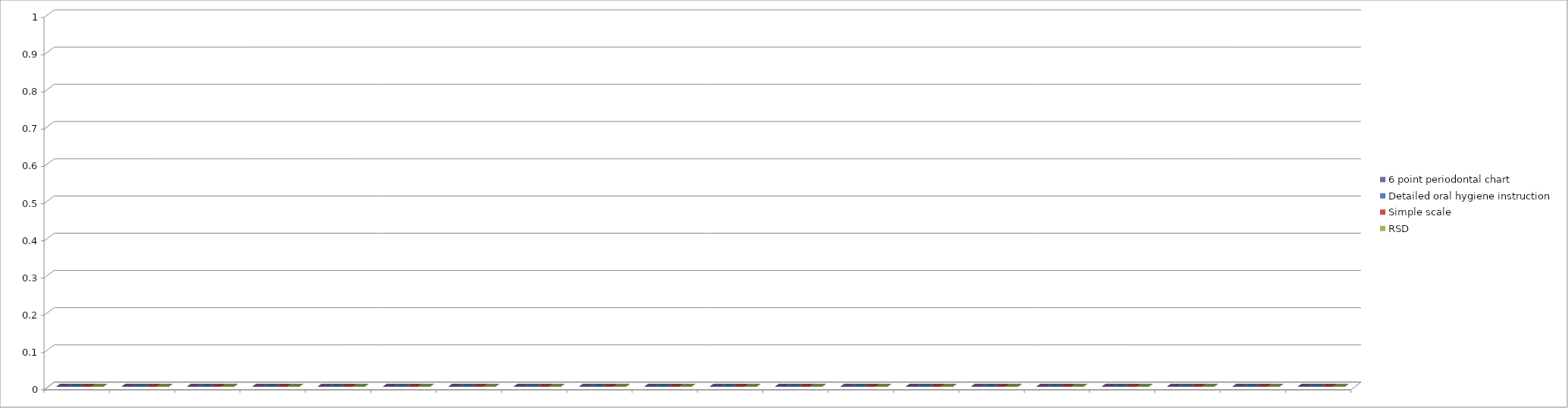
| Category | 6 point periodontal chart | Detailed oral hygiene instruction | Simple scale | RSD |
|---|---|---|---|---|
| 0 | 0 | 0 | 0 | 0 |
| 1 | 0 | 0 | 0 | 0 |
| 2 | 0 | 0 | 0 | 0 |
| 3 | 0 | 0 | 0 | 0 |
| 4 | 0 | 0 | 0 | 0 |
| 5 | 0 | 0 | 0 | 0 |
| 6 | 0 | 0 | 0 | 0 |
| 7 | 0 | 0 | 0 | 0 |
| 8 | 0 | 0 | 0 | 0 |
| 9 | 0 | 0 | 0 | 0 |
| 10 | 0 | 0 | 0 | 0 |
| 11 | 0 | 0 | 0 | 0 |
| 12 | 0 | 0 | 0 | 0 |
| 13 | 0 | 0 | 0 | 0 |
| 14 | 0 | 0 | 0 | 0 |
| 15 | 0 | 0 | 0 | 0 |
| 16 | 0 | 0 | 0 | 0 |
| 17 | 0 | 0 | 0 | 0 |
| 18 | 0 | 0 | 0 | 0 |
| 19 | 0 | 0 | 0 | 0 |